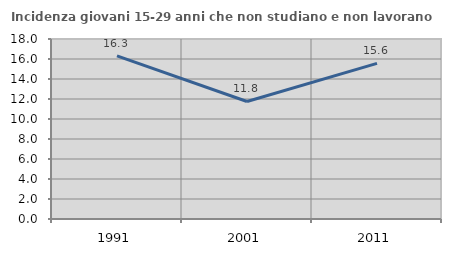
| Category | Incidenza giovani 15-29 anni che non studiano e non lavorano  |
|---|---|
| 1991.0 | 16.31 |
| 2001.0 | 11.751 |
| 2011.0 | 15.561 |